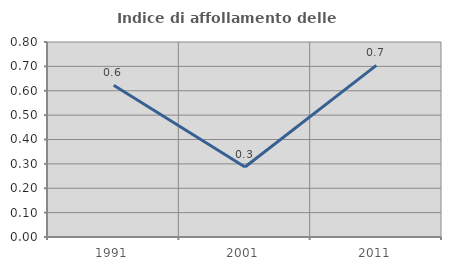
| Category | Indice di affollamento delle abitazioni  |
|---|---|
| 1991.0 | 0.623 |
| 2001.0 | 0.287 |
| 2011.0 | 0.704 |